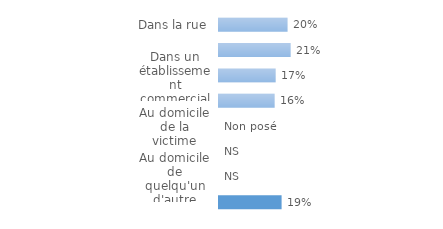
| Category | Series 0 |
|---|---|
| Dans la rue | 0.203 |
| Dans un transport en commun | 0.212 |
| Dans un établissement commercial | 0.168 |
| Sur le lieu de travail ou d'études  | 0.165 |
| Au domicile de la victime | 0 |
| Dans l'immeuble de la victime | 0 |
| Au domicile de quelqu'un d'autre | 0 |
| Dans un autre lieu | 0.185 |